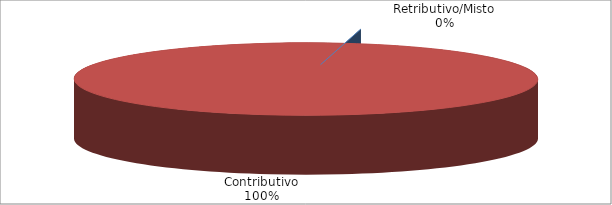
| Category | Series 1 |
|---|---|
| Retributivo/Misto | 0 |
| Contributivo | 7683 |